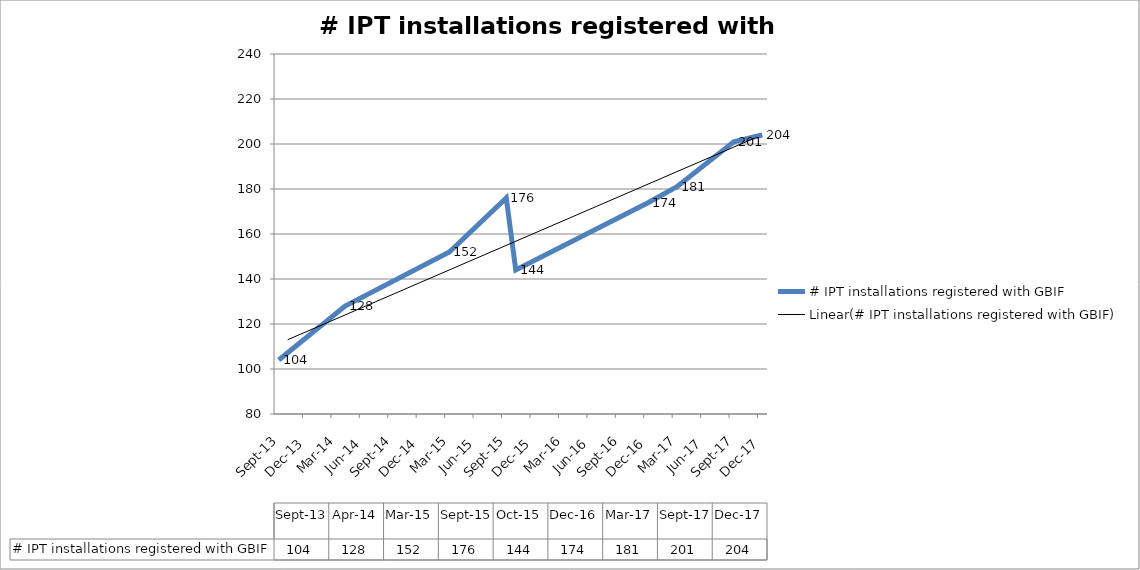
| Category | # IPT installations registered with GBIF |
|---|---|
| 2013-09-01 | 104 |
| 2014-04-01 | 128 |
| 2015-03-01 | 152 |
| 2015-09-01 | 176 |
| 2015-10-16 | 144 |
| 2016-12-01 | 174 |
| 2017-03-01 | 181 |
| 2017-09-20 | 201 |
| 2017-12-04 | 204 |